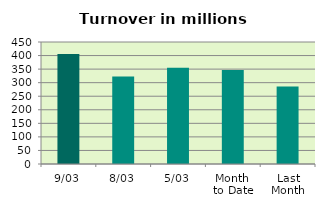
| Category | Series 0 |
|---|---|
| 9/03 | 405.991 |
| 8/03 | 323.071 |
| 5/03 | 354.896 |
| Month 
to Date | 346.996 |
| Last
Month | 285.972 |